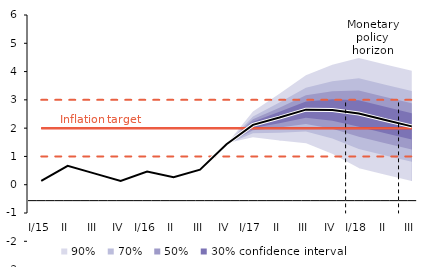
| Category | Inflation Target | Inflation Target - lower bound | Inflation Target - upper bound | linka | Střed předpovědi |
|---|---|---|---|---|---|
| I/15 | 2 | 1 | 3 | 0.133 | 0.133 |
| II | 2 | 1 | 3 | 0.667 | 0.667 |
| III | 2 | 1 | 3 | 0.4 | 0.4 |
| IV | 2 | 1 | 3 | 0.133 | 0.133 |
| I/16 | 2 | 1 | 3 | 0.467 | 0.467 |
| II | 2 | 1 | 3 | 0.267 | 0.267 |
| III | 2 | 1 | 3 | 0.533 | 0.533 |
| IV | 2 | 1 | 3 | 1.433 | 1.433 |
| I/17 | 2 | 1 | 3 | 2.117 | 2.117 |
| II | 2 | 1 | 3 | 2.374 | 2.374 |
| III | 2 | 1 | 3 | 2.654 | 2.654 |
| IV | 2 | 1 | 3 | 2.643 | 2.643 |
| I/18 | 2 | 1 | 3 | 2.515 | 2.515 |
| II | 2 | 1 | 3 | 2.285 | 2.285 |
| III | 2 | 1 | 3 | 2.062 | 2.062 |